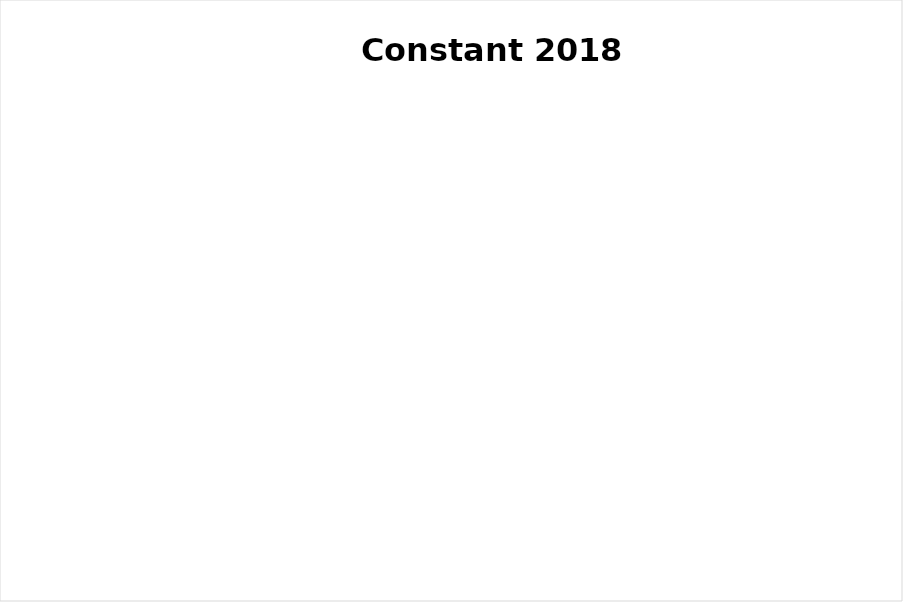
| Category | Series 0 |
|---|---|
| Crops | 0 |
| Livestock | 0 |
| Poultry | 0 |
| Fisheries | 0 |